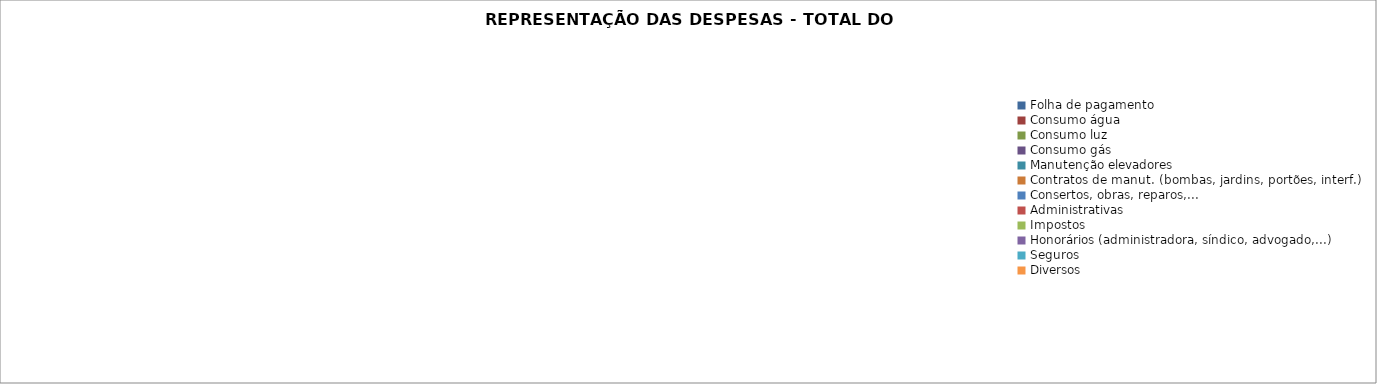
| Category | Series 0 |
|---|---|
| Folha de pagamento | 0 |
| Consumo água | 0 |
| Consumo luz | 0 |
| Consumo gás | 0 |
| Manutenção elevadores | 0 |
| Contratos de manut. (bombas, jardins, portões, interf.) | 0 |
| Consertos, obras, reparos,... | 0 |
| Administrativas | 0 |
| Impostos | 0 |
| Honorários (administradora, síndico, advogado,...) | 0 |
| Seguros | 0 |
| Diversos | 0 |